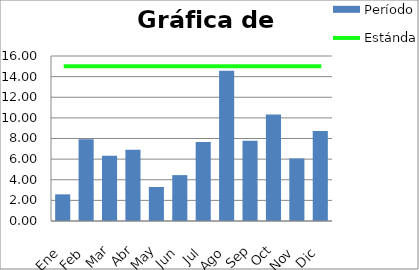
| Category | Período |
|---|---|
| Ene | 2.584 |
| Feb | 7.936 |
| Mar | 6.334 |
| Abr | 6.92 |
| May | 3.298 |
| Jun | 4.45 |
| Jul | 7.672 |
| Ago | 14.569 |
| Sep | 7.777 |
| Oct | 10.335 |
| Nov | 6.066 |
| Dic | 8.724 |